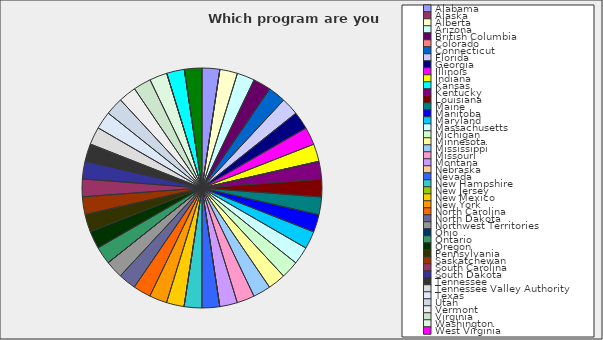
| Category | Series 0 |
|---|---|
| Alabama | 0.024 |
| Alaska | 0 |
| Alberta | 0.024 |
| Arizona | 0.024 |
| British Columbia | 0.024 |
| Colorado | 0 |
| Connecticut | 0.024 |
| Florida | 0.024 |
| Georgia | 0.024 |
| Illinois | 0.024 |
| Indiana | 0.024 |
| Kansas | 0 |
| Kentucky | 0.024 |
| Louisiana | 0.024 |
| Maine | 0.024 |
| Manitoba | 0.024 |
| Maryland | 0.024 |
| Massachusetts | 0.024 |
| Michigan | 0.024 |
| Minnesota | 0.024 |
| Mississippi | 0.024 |
| Missouri | 0.024 |
| Montana | 0.024 |
| Nebraska | 0 |
| Nevada | 0.024 |
| New Hampshire | 0.024 |
| New Jersey | 0 |
| New Mexico | 0.024 |
| New York | 0.024 |
| North Carolina | 0.024 |
| North Dakota | 0.024 |
| Northwest Territories | 0.024 |
| Ohio | 0 |
| Ontario | 0.024 |
| Oregon | 0.024 |
| Pennsylvania | 0.024 |
| Saskatchewan | 0.024 |
| South Carolina | 0.024 |
| South Dakota | 0.024 |
| Tennessee | 0.024 |
| Tennessee Valley Authority | 0.024 |
| Texas | 0.024 |
| Utah | 0.024 |
| Vermont | 0.024 |
| Virginia | 0.024 |
| Washington | 0.024 |
| West Virginia | 0 |
| Wisconsin | 0.024 |
| Wyoming | 0 |
| Yukon | 0.024 |